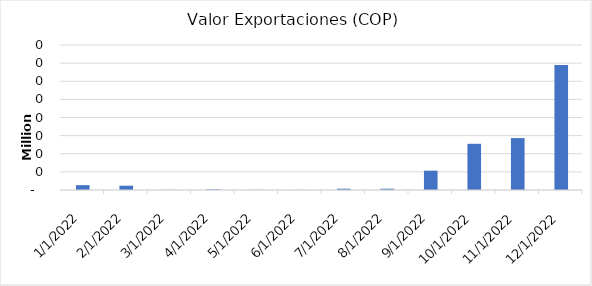
| Category | Valor Exportaciones (COP) |
|---|---|
| 1/1/22 | 2665.629 |
| 2/1/22 | 2369.699 |
| 3/1/22 | 101.034 |
| 4/1/22 | 333.931 |
| 5/1/22 | 120.139 |
| 6/1/22 | 59.644 |
| 7/1/22 | 722.847 |
| 8/1/22 | 699.548 |
| 9/1/22 | 10655.598 |
| 10/1/22 | 25492.773 |
| 11/1/22 | 28655.832 |
| 12/1/22 | 68914.928 |